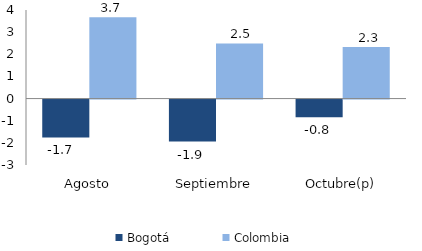
| Category | Bogotá | Colombia |
|---|---|---|
| Agosto | -1.708 | 3.668 |
| Septiembre | -1.894 | 2.489 |
| Octubre(p) | -0.803 | 2.327 |